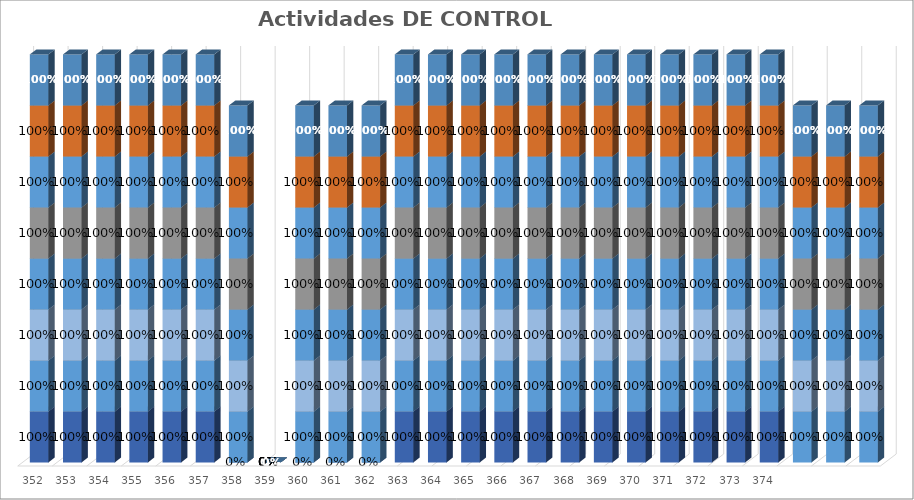
| Category | % Avance |
|---|---|
| 352.0 | 1 |
| 353.0 | 1 |
| 354.0 | 1 |
| 355.0 | 1 |
| 356.0 | 1 |
| 357.0 | 1 |
| 358.0 | 1 |
| 359.0 | 0 |
| 360.0 | 1 |
| 361.0 | 1 |
| 362.0 | 1 |
| 363.0 | 1 |
| 364.0 | 1 |
| 365.0 | 1 |
| 366.0 | 1 |
| 367.0 | 1 |
| 368.0 | 1 |
| 369.0 | 1 |
| 370.0 | 1 |
| 371.0 | 1 |
| 372.0 | 1 |
| 373.0 | 1 |
| 374.0 | 1 |